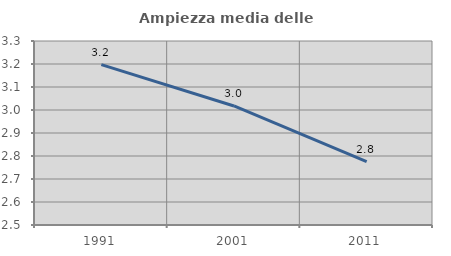
| Category | Ampiezza media delle famiglie |
|---|---|
| 1991.0 | 3.197 |
| 2001.0 | 3.018 |
| 2011.0 | 2.776 |